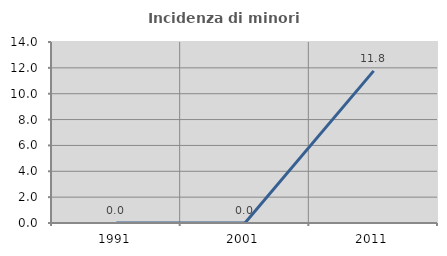
| Category | Incidenza di minori stranieri |
|---|---|
| 1991.0 | 0 |
| 2001.0 | 0 |
| 2011.0 | 11.765 |